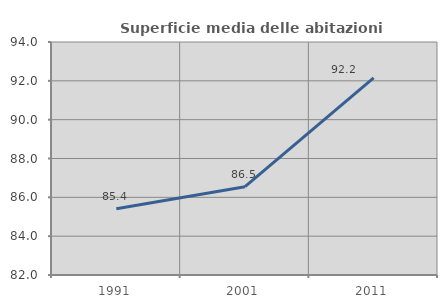
| Category | Superficie media delle abitazioni occupate |
|---|---|
| 1991.0 | 85.41 |
| 2001.0 | 86.55 |
| 2011.0 | 92.151 |